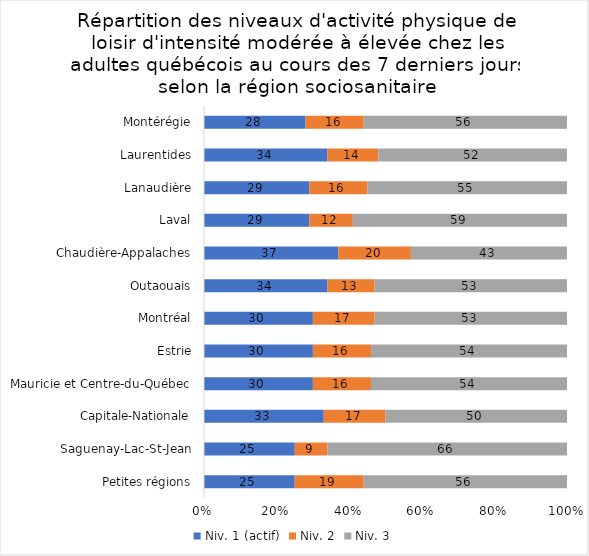
| Category | Niv. 1 (actif) | Niv. 2 | Niv. 3 |
|---|---|---|---|
| Petites régions | 25 | 19 | 56 |
| Saguenay-Lac-St-Jean | 25 | 9 | 66 |
| Capitale-Nationale | 33 | 17 | 50 |
| Mauricie et Centre-du-Québec | 30 | 16 | 54 |
| Estrie | 30 | 16 | 54 |
| Montréal | 30 | 17 | 53 |
| Outaouais | 34 | 13 | 53 |
| Chaudière-Appalaches | 37 | 20 | 43 |
| Laval | 29 | 12 | 59 |
| Lanaudière | 29 | 16 | 55 |
| Laurentides | 34 | 14 | 52 |
| Montérégie | 28 | 16 | 56 |